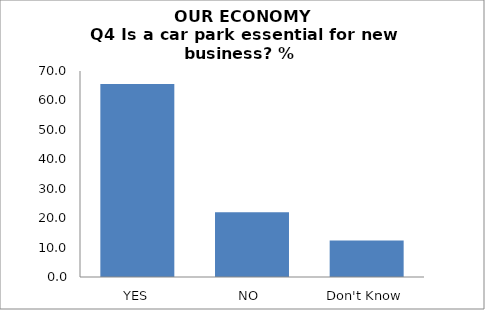
| Category | Series 0 |
|---|---|
| YES | 65.565 |
| NO  | 22.039 |
| Don't Know | 12.397 |